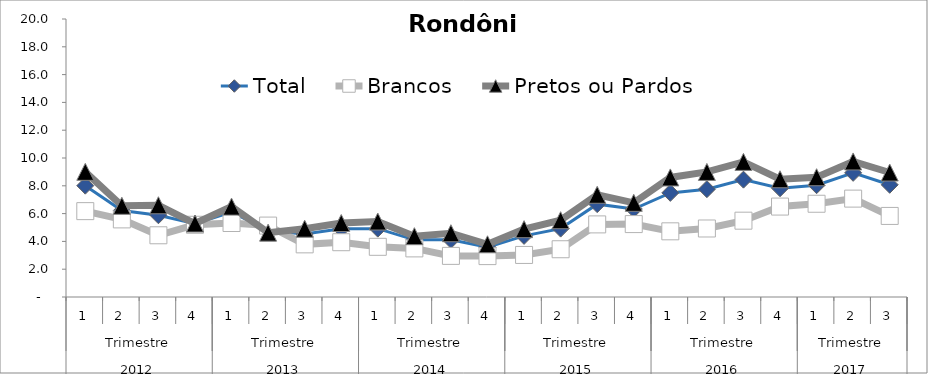
| Category | Total | Brancos | Pretos ou Pardos |
|---|---|---|---|
| 0 | 8.008 | 6.177 | 9.004 |
| 1 | 6.224 | 5.583 | 6.561 |
| 2 | 5.882 | 4.44 | 6.599 |
| 3 | 5.274 | 5.196 | 5.286 |
| 4 | 6.114 | 5.323 | 6.503 |
| 5 | 4.771 | 5.137 | 4.628 |
| 6 | 4.534 | 3.787 | 4.914 |
| 7 | 4.902 | 3.942 | 5.319 |
| 8 | 4.917 | 3.61 | 5.432 |
| 9 | 4.112 | 3.497 | 4.375 |
| 10 | 4.111 | 2.958 | 4.586 |
| 11 | 3.575 | 2.943 | 3.793 |
| 12 | 4.396 | 3.026 | 4.88 |
| 13 | 4.919 | 3.436 | 5.524 |
| 14 | 6.679 | 5.223 | 7.354 |
| 15 | 6.331 | 5.245 | 6.776 |
| 16 | 7.49 | 4.725 | 8.602 |
| 17 | 7.757 | 4.929 | 8.998 |
| 18 | 8.441 | 5.491 | 9.721 |
| 19 | 7.824 | 6.506 | 8.471 |
| 20 | 8.044 | 6.708 | 8.616 |
| 21 | 8.933 | 7.078 | 9.753 |
| 22 | 8.072 | 5.833 | 8.956 |